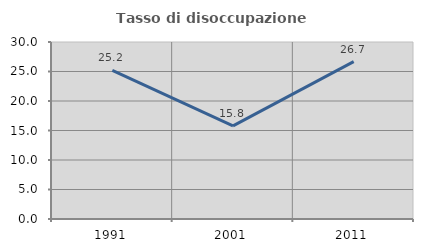
| Category | Tasso di disoccupazione giovanile  |
|---|---|
| 1991.0 | 25.182 |
| 2001.0 | 15.789 |
| 2011.0 | 26.667 |